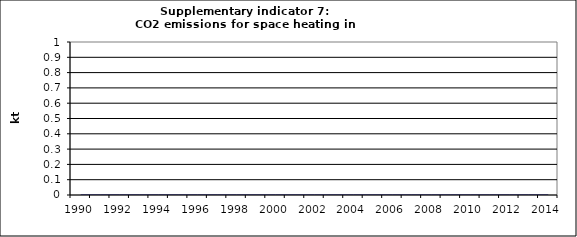
| Category | CO2 emissions for space heating in households, kt |
|---|---|
| 1990 | 0 |
| 1991 | 0 |
| 1992 | 0 |
| 1993 | 0 |
| 1994 | 0 |
| 1995 | 0 |
| 1996 | 0 |
| 1997 | 0 |
| 1998 | 0 |
| 1999 | 0 |
| 2000 | 0 |
| 2001 | 0 |
| 2002 | 0 |
| 2003 | 0 |
| 2004 | 0 |
| 2005 | 0 |
| 2006 | 0 |
| 2007 | 0 |
| 2008 | 0 |
| 2009 | 0 |
| 2010 | 0 |
| 2011 | 0 |
| 2012 | 0 |
| 2013 | 0 |
| 2014 | 0 |